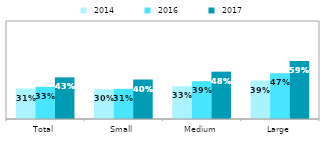
| Category |  2014 |  2016 |  2017 |
|---|---|---|---|
| Total | 0.311 | 0.328 | 0.425 |
| Small | 0.303 | 0.308 | 0.403 |
| Medium | 0.334 | 0.386 | 0.483 |
| Large | 0.392 | 0.467 | 0.592 |